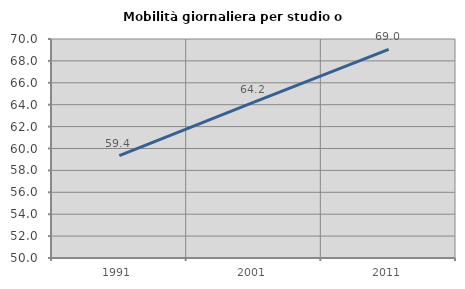
| Category | Mobilità giornaliera per studio o lavoro |
|---|---|
| 1991.0 | 59.351 |
| 2001.0 | 64.244 |
| 2011.0 | 69.044 |